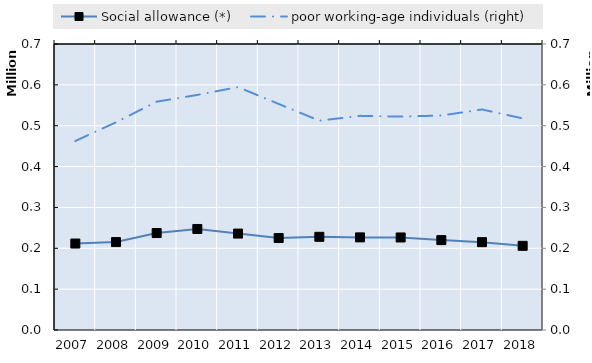
| Category | Social allowance (*) | Series 4 | Series 5 | Series 6 | Series 7 | Series 8 | Series 9 | Series 10 | Series 11 | Series 12 | Series 13 | Series 14 | Series 15 | Series 16 | Series 17 | Series 18 | Series 19 |
|---|---|---|---|---|---|---|---|---|---|---|---|---|---|---|---|---|---|
| 2007.0 | 211605 |  |  |  |  |  |  |  |  |  |  |  |  |  |  |  |  |
| 2008.0 | 215172 |  |  |  |  |  |  |  |  |  |  |  |  |  |  |  |  |
| 2009.0 | 237304 |  |  |  |  |  |  |  |  |  |  |  |  |  |  |  |  |
| 2010.0 | 247246 |  |  |  |  |  |  |  |  |  |  |  |  |  |  |  |  |
| 2011.0 | 235975 |  |  |  |  |  |  |  |  |  |  |  |  |  |  |  |  |
| 2012.0 | 225110 |  |  |  |  |  |  |  |  |  |  |  |  |  |  |  |  |
| 2013.0 | 228056 |  |  |  |  |  |  |  |  |  |  |  |  |  |  |  |  |
| 2014.0 | 226684 |  |  |  |  |  |  |  |  |  |  |  |  |  |  |  |  |
| 2015.0 | 226511 |  |  |  |  |  |  |  |  |  |  |  |  |  |  |  |  |
| 2016.0 | 220011 |  |  |  |  |  |  |  |  |  |  |  |  |  |  |  |  |
| 2017.0 | 215000 |  |  |  |  |  |  |  |  |  |  |  |  |  |  |  |  |
| 2018.0 | 206000 |  |  |  |  |  |  |  |  |  |  |  |  |  |  |  |  |